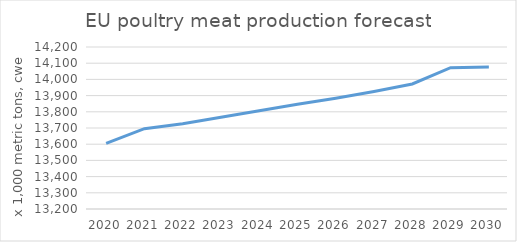
| Category | Poultry meat |
|---|---|
| 2020.0 | 13605 |
| 2021.0 | 13696 |
| 2022.0 | 13726 |
| 2023.0 | 13766 |
| 2024.0 | 13806 |
| 2025.0 | 13846 |
| 2026.0 | 13883 |
| 2027.0 | 13925 |
| 2028.0 | 13972 |
| 2029.0 | 14072 |
| 2030.0 | 14076 |